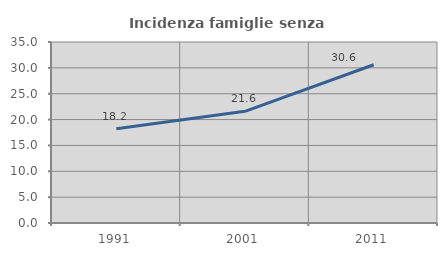
| Category | Incidenza famiglie senza nuclei |
|---|---|
| 1991.0 | 18.238 |
| 2001.0 | 21.601 |
| 2011.0 | 30.596 |